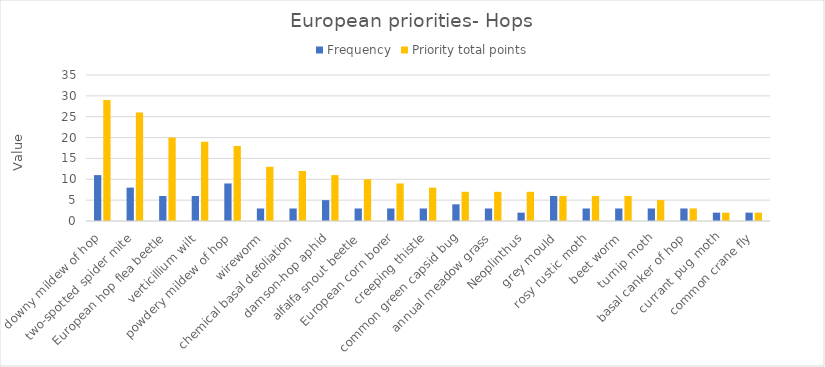
| Category | Frequency | Priority total points |
|---|---|---|
| downy mildew of hop | 11 | 29 |
| two-spotted spider mite | 8 | 26 |
| European hop flea beetle | 6 | 20 |
| verticillium wilt | 6 | 19 |
| powdery mildew of hop | 9 | 18 |
| wireworm | 3 | 13 |
| chemical basal defoliation | 3 | 12 |
| damson-hop aphid | 5 | 11 |
| alfalfa snout beetle | 3 | 10 |
| European corn borer | 3 | 9 |
| creeping thistle | 3 | 8 |
| common green capsid bug | 4 | 7 |
| annual meadow grass | 3 | 7 |
| Neoplinthus | 2 | 7 |
| grey mould | 6 | 6 |
| rosy rustic moth | 3 | 6 |
| beet worm | 3 | 6 |
| turnip moth | 3 | 5 |
| basal canker of hop | 3 | 3 |
| currant pug moth | 2 | 2 |
| common crane fly | 2 | 2 |